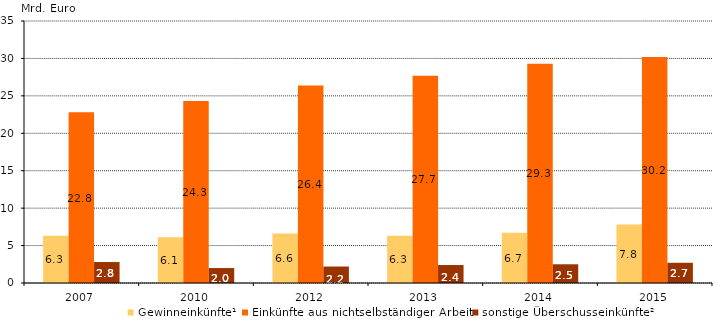
| Category | Gewinneinkünfte¹ | Einkünfte aus nichtselbständiger Arbeit | sonstige Überschusseinkünfte² |
|---|---|---|---|
| 2007.0 | 6.3 | 22.8 | 2.8 |
| 2010.0 | 6.1 | 24.3 | 2 |
| 2012.0 | 6.6 | 26.4 | 2.2 |
| 2013.0 | 6.3 | 27.7 | 2.4 |
| 2014.0 | 6.7 | 29.3 | 2.5 |
| 2015.0 | 7.8 | 30.2 | 2.7 |